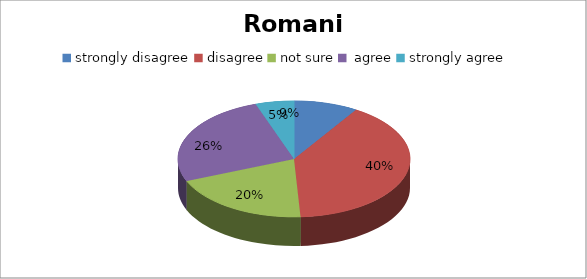
| Category | Romania |
|---|---|
| strongly disagree | 10 |
| disagree | 45 |
| not sure | 22 |
|  agree | 29 |
| strongly agree | 6 |